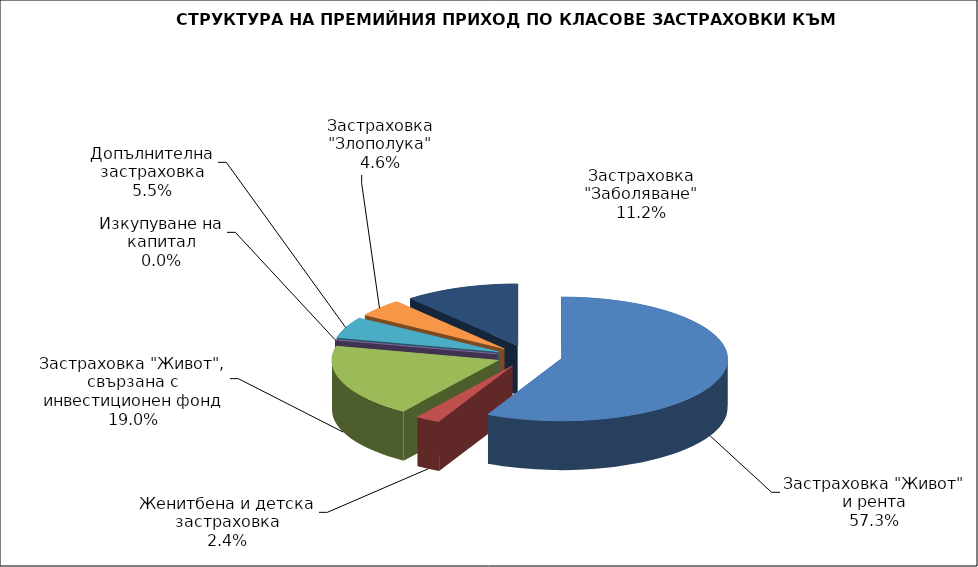
| Category | Series 0 |
|---|---|
| Застраховка "Живот" и рента | 108755496.206 |
| Женитбена и детска застраховка | 4524756.65 |
| Застраховка "Живот", свързана с инвестиционен фонд | 36119802.538 |
| Изкупуване на капитал | 0 |
| Допълнителна застраховка | 10474354.69 |
| Застраховка "Злополука" | 8786045.77 |
| Застраховка "Заболяване" | 21269789.56 |